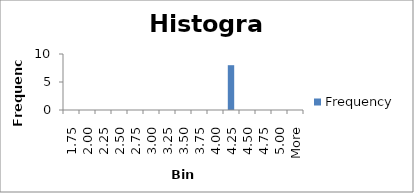
| Category | Frequency |
|---|---|
| 1.75 | 0 |
| 2.00 | 0 |
| 2.25 | 0 |
| 2.50 | 0 |
| 2.75 | 0 |
| 3.00 | 0 |
| 3.25 | 0 |
| 3.50 | 0 |
| 3.75 | 0 |
| 4.00 | 0 |
| 4.25 | 8 |
| 4.50 | 0 |
| 4.75 | 0 |
| 5.00 | 0 |
| More | 0 |